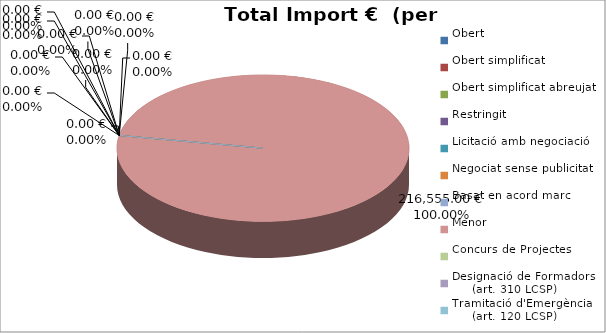
| Category | Total preu
(amb IVA) |
|---|---|
| Obert | 0 |
| Obert simplificat | 0 |
| Obert simplificat abreujat | 0 |
| Restringit | 0 |
| Licitació amb negociació | 0 |
| Negociat sense publicitat | 0 |
| Basat en acord marc | 0 |
| Menor | 216555 |
| Concurs de Projectes | 0 |
| Designació de Formadors
     (art. 310 LCSP) | 0 |
| Tramitació d'Emergència
     (art. 120 LCSP) | 0 |